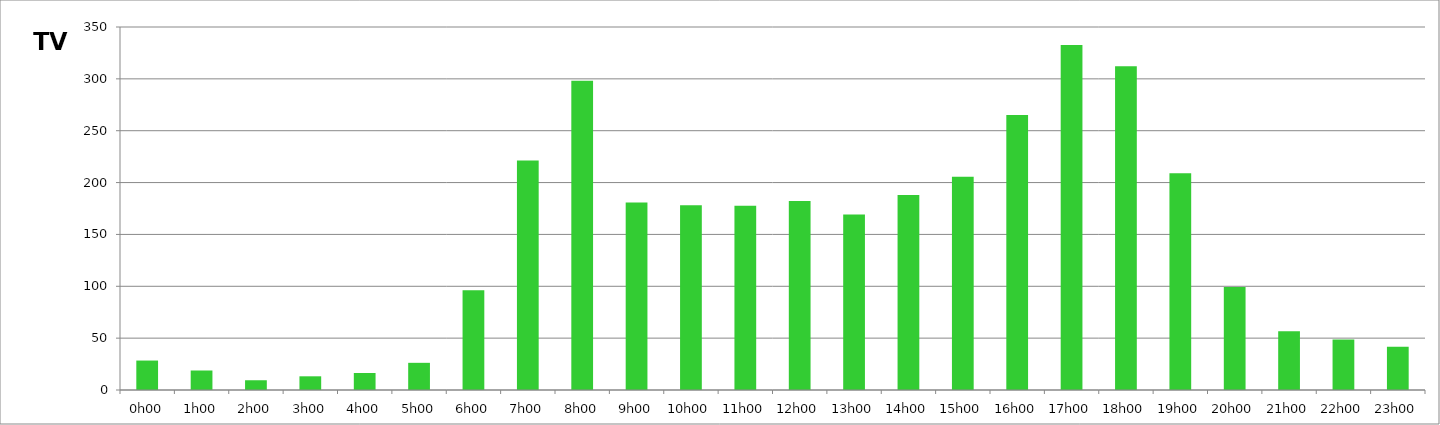
| Category | TV |
|---|---|
| 0.0 | 28.4 |
| 0.041666666666666664 | 18.8 |
| 0.08333333333333333 | 9.4 |
| 0.125 | 13.2 |
| 0.16666666666666666 | 16.4 |
| 0.20833333333333334 | 26.2 |
| 0.25 | 96.2 |
| 0.2916666666666667 | 221.2 |
| 0.3333333333333333 | 298.2 |
| 0.375 | 180.8 |
| 0.4166666666666667 | 178.2 |
| 0.4583333333333333 | 177.6 |
| 0.5 | 182.2 |
| 0.5416666666666666 | 169.2 |
| 0.5833333333333334 | 188 |
| 0.625 | 205.6 |
| 0.6666666666666666 | 265.2 |
| 0.7083333333333334 | 332.6 |
| 0.75 | 312.2 |
| 0.7916666666666666 | 209 |
| 0.8333333333333334 | 99.2 |
| 0.875 | 56.6 |
| 0.9166666666666666 | 48.6 |
| 0.9583333333333334 | 41.6 |